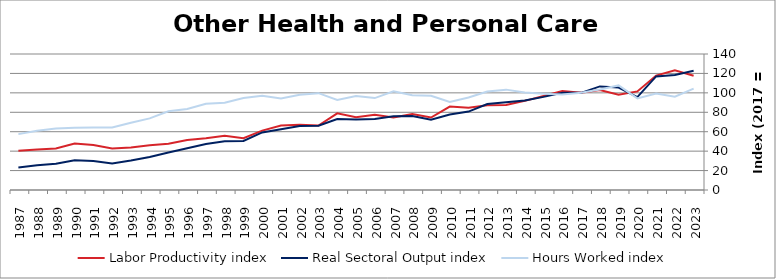
| Category | Labor Productivity index | Real Sectoral Output index | Hours Worked index |
|---|---|---|---|
| 2023.0 | 117.55 | 122.682 | 104.365 |
| 2022.0 | 123.237 | 118.441 | 96.108 |
| 2021.0 | 117.77 | 116.892 | 99.254 |
| 2020.0 | 101.465 | 95.675 | 94.293 |
| 2019.0 | 97.972 | 105.457 | 107.64 |
| 2018.0 | 102.99 | 106.647 | 103.551 |
| 2017.0 | 100 | 100 | 100 |
| 2016.0 | 101.867 | 100.096 | 98.261 |
| 2015.0 | 96.74 | 95.865 | 99.095 |
| 2014.0 | 91.771 | 92.085 | 100.342 |
| 2013.0 | 87.485 | 90.386 | 103.316 |
| 2012.0 | 87.284 | 88.502 | 101.395 |
| 2011.0 | 84.763 | 80.737 | 95.25 |
| 2010.0 | 85.842 | 77.79 | 90.621 |
| 2009.0 | 74.622 | 72.451 | 97.091 |
| 2008.0 | 78.127 | 76.224 | 97.564 |
| 2007.0 | 74.575 | 75.814 | 101.662 |
| 2006.0 | 77.366 | 73.209 | 94.627 |
| 2005.0 | 74.897 | 72.509 | 96.811 |
| 2004.0 | 78.91 | 73.145 | 92.693 |
| 2003.0 | 66.297 | 66.077 | 99.668 |
| 2002.0 | 67.13 | 65.778 | 97.985 |
| 2001.0 | 66.419 | 62.57 | 94.204 |
| 2000.0 | 61.13 | 59.28 | 96.973 |
| 1999.0 | 53.292 | 50.445 | 94.657 |
| 1998.0 | 55.728 | 50.078 | 89.862 |
| 1997.0 | 53.371 | 47.331 | 88.683 |
| 1996.0 | 51.502 | 42.897 | 83.292 |
| 1995.0 | 47.642 | 38.65 | 81.126 |
| 1994.0 | 46.151 | 34.009 | 73.691 |
| 1993.0 | 43.854 | 30.34 | 69.184 |
| 1992.0 | 42.638 | 27.395 | 64.251 |
| 1991.0 | 46.234 | 29.758 | 64.365 |
| 1990.0 | 47.907 | 30.719 | 64.122 |
| 1989.0 | 42.753 | 27.063 | 63.302 |
| 1988.0 | 41.666 | 25.383 | 60.919 |
| 1987.0 | 40.397 | 23.232 | 57.509 |